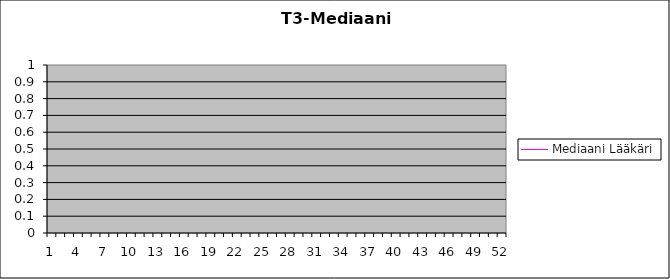
| Category | Mediaani Lääkäri |
|---|---|
| 0 | 0 |
| 1 | 0 |
| 2 | 0 |
| 3 | 0 |
| 4 | 0 |
| 5 | 0 |
| 6 | 0 |
| 7 | 0 |
| 8 | 0 |
| 9 | 0 |
| 10 | 0 |
| 11 | 0 |
| 12 | 0 |
| 13 | 0 |
| 14 | 0 |
| 15 | 0 |
| 16 | 0 |
| 17 | 0 |
| 18 | 0 |
| 19 | 0 |
| 20 | 0 |
| 21 | 0 |
| 22 | 0 |
| 23 | 0 |
| 24 | 0 |
| 25 | 0 |
| 26 | 0 |
| 27 | 0 |
| 28 | 0 |
| 29 | 0 |
| 30 | 0 |
| 31 | 0 |
| 32 | 0 |
| 33 | 0 |
| 34 | 0 |
| 35 | 0 |
| 36 | 0 |
| 37 | 0 |
| 38 | 0 |
| 39 | 0 |
| 40 | 0 |
| 41 | 0 |
| 42 | 0 |
| 43 | 0 |
| 44 | 0 |
| 45 | 0 |
| 46 | 0 |
| 47 | 0 |
| 48 | 0 |
| 49 | 0 |
| 50 | 0 |
| 51 | 0 |